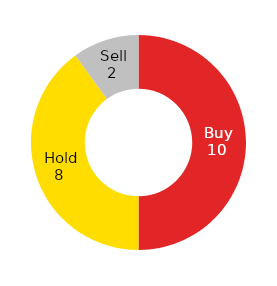
| Category | Series 0 |
|---|---|
| Buy | 10 |
| Hold | 8 |
| Sell | 2 |